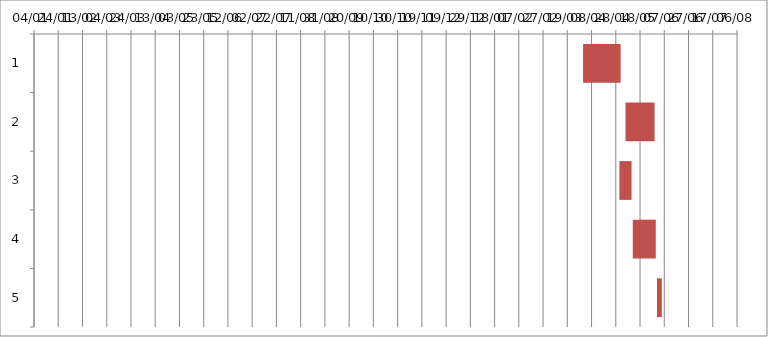
| Category | Fecha de inicio | DURACIÓN |
|---|---|---|
| 0 | 4/1/17 | 31 |
| 1 | 5/6/17 | 24 |
| 2 | 5/1/17 | 10 |
| 3 | 5/12/17 | 19 |
| 4 | 6/1/17 | 4 |